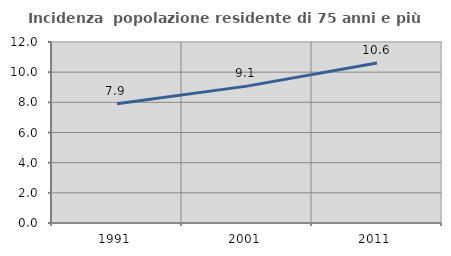
| Category | Incidenza  popolazione residente di 75 anni e più |
|---|---|
| 1991.0 | 7.911 |
| 2001.0 | 9.075 |
| 2011.0 | 10.61 |